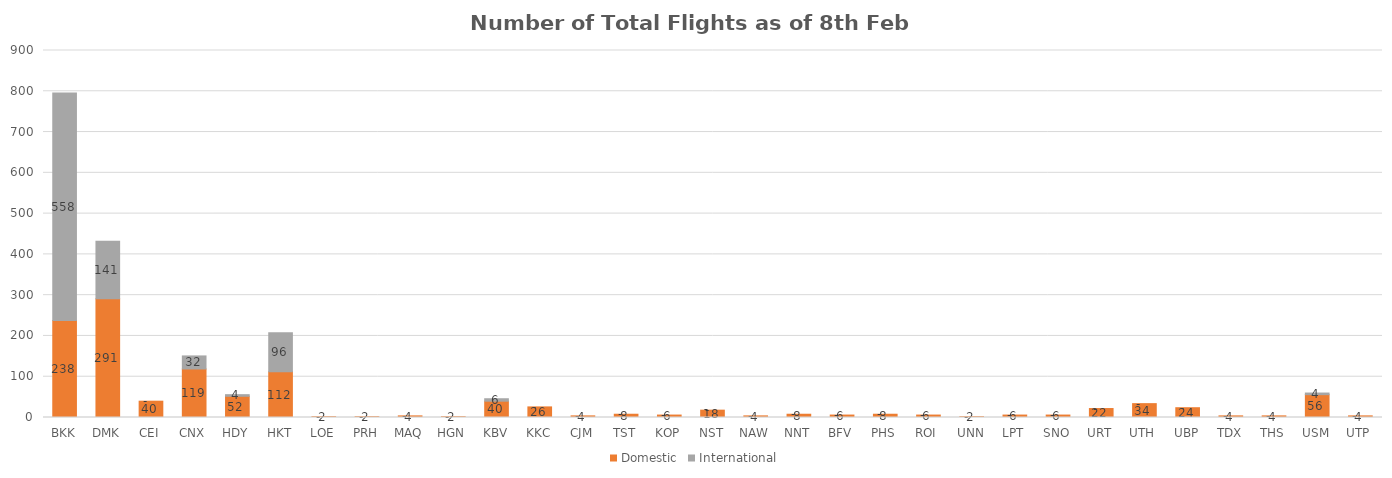
| Category | Domestic | International |
|---|---|---|
| BKK | 238 | 558 |
| DMK | 291 | 141 |
| CEI | 40 | 0 |
| CNX | 119 | 32 |
| HDY | 52 | 4 |
| HKT | 112 | 96 |
| LOE | 2 | 0 |
| PRH | 2 | 0 |
| MAQ | 4 | 0 |
| HGN | 2 | 0 |
| KBV | 40 | 6 |
| KKC | 26 | 0 |
| CJM | 4 | 0 |
| TST | 8 | 0 |
| KOP | 6 | 0 |
| NST | 18 | 0 |
| NAW | 4 | 0 |
| NNT | 8 | 0 |
| BFV | 6 | 0 |
| PHS | 8 | 0 |
| ROI | 6 | 0 |
| UNN | 2 | 0 |
| LPT | 6 | 0 |
| SNO | 6 | 0 |
| URT | 22 | 0 |
| UTH | 34 | 0 |
| UBP | 24 | 0 |
| TDX | 4 | 0 |
| THS | 4 | 0 |
| USM | 56 | 4 |
| UTP | 4 | 0 |